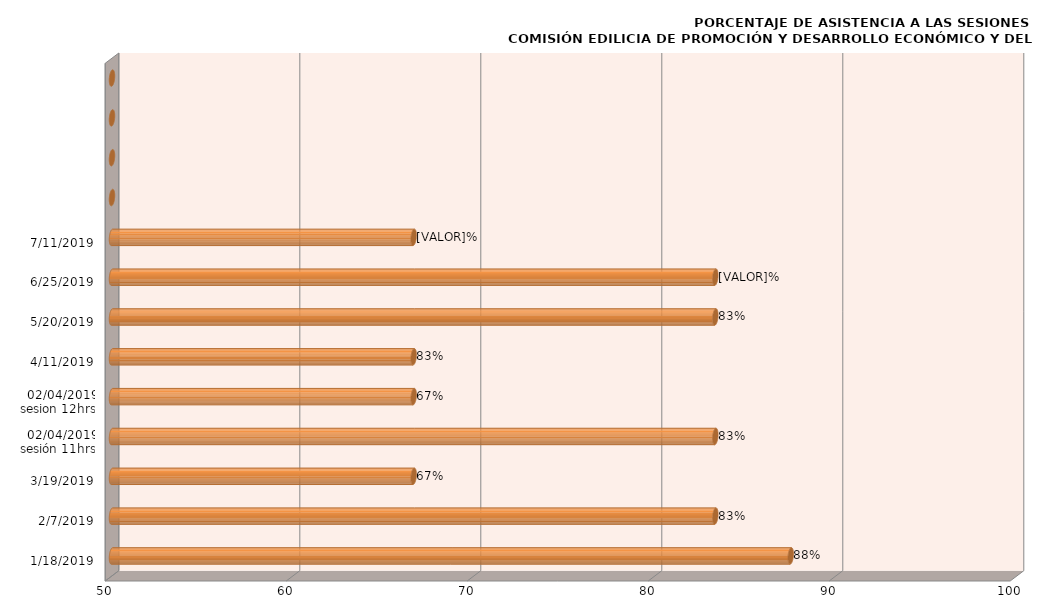
| Category | Series 0 |
|---|---|
| 18/01/2019 | 87.5 |
| 07/02/2019 | 83.333 |
| 19/03/2019 | 66.667 |
| 02/04/2019
sesión 11hrs | 83.333 |
| 02/04/2019
sesion 12hrs | 66.667 |
| 11/04/2019 | 66.667 |
| 20/05/2019 | 83.333 |
| 25/06/2019 | 83.333 |
| 11/07/2019 | 66.667 |